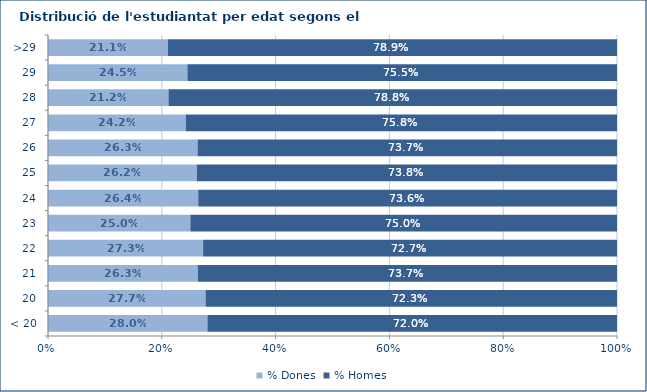
| Category | % Dones | % Homes |
|---|---|---|
| < 20 | 0.28 | 0.72 |
| 20 | 0.277 | 0.723 |
| 21 | 0.263 | 0.737 |
| 22 | 0.273 | 0.727 |
| 23 | 0.25 | 0.75 |
| 24 | 0.264 | 0.736 |
| 25 | 0.262 | 0.738 |
| 26 | 0.263 | 0.737 |
| 27 | 0.242 | 0.758 |
| 28 | 0.212 | 0.788 |
| 29 | 0.245 | 0.755 |
| >29 | 0.211 | 0.789 |